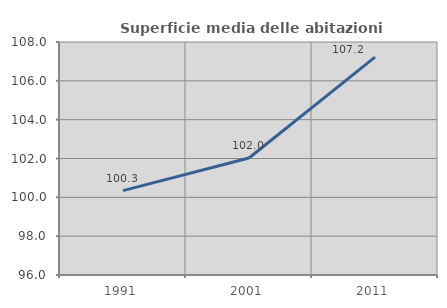
| Category | Superficie media delle abitazioni occupate |
|---|---|
| 1991.0 | 100.347 |
| 2001.0 | 102.024 |
| 2011.0 | 107.22 |